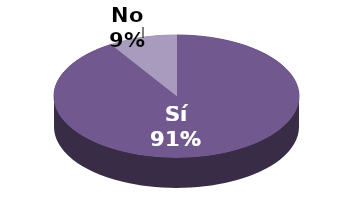
| Category | Series 1 |
|---|---|
| Sí | 81 |
| No | 8 |